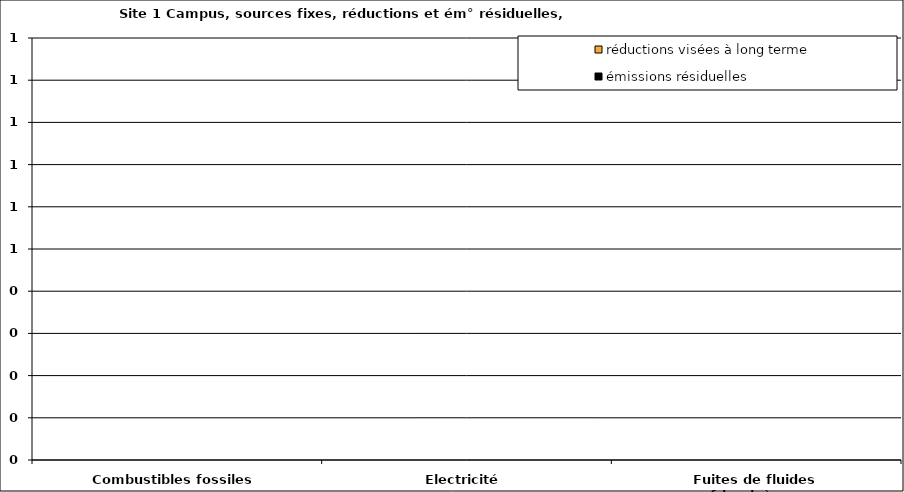
| Category | émissions résiduelles | réductions visées à long terme |
|---|---|---|
| Combustibles fossiles | 0 | 0 |
| Electricité | 0 | 0 |
| Fuites de fluides frigorigènes | 0 | 0 |